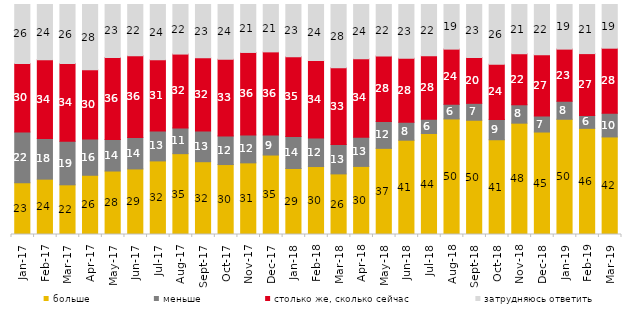
| Category | больше | меньше | столько же, сколько сейчас | затрудняюсь ответить |
|---|---|---|---|---|
| 2017-01-01 | 22.5 | 22.05 | 29.85 | 25.6 |
| 2017-02-01 | 24.05 | 17.7 | 34.2 | 24 |
| 2017-03-01 | 21.6 | 18.9 | 33.8 | 25.7 |
| 2017-04-01 | 25.75 | 15.8 | 30.05 | 28.4 |
| 2017-05-01 | 27.6 | 13.7 | 35.7 | 23 |
| 2017-06-01 | 28.5 | 13.65 | 35.6 | 22.25 |
| 2017-07-01 | 32 | 13 | 30.95 | 24.05 |
| 2017-08-01 | 35.15 | 11.2 | 32.1 | 21.55 |
| 2017-09-01 | 31.65 | 13.3 | 31.95 | 23.1 |
| 2017-10-01 | 30.4 | 12.45 | 33.35 | 23.75 |
| 2017-11-01 | 31.15 | 12.15 | 35.85 | 20.85 |
| 2017-12-01 | 34.55 | 8.7 | 36.15 | 20.6 |
| 2018-01-01 | 28.7 | 13.9 | 34.65 | 22.75 |
| 2018-02-01 | 29.55 | 12.4 | 33.7 | 24.35 |
| 2018-03-01 | 26.35 | 12.75 | 33.35 | 27.55 |
| 2018-04-01 | 29.6 | 12.7 | 34.1 | 23.6 |
| 2018-05-01 | 37.45 | 11.7 | 28.45 | 22.4 |
| 2018-06-01 | 41 | 7.8 | 27.85 | 23.35 |
| 2018-07-01 | 43.9 | 6.25 | 27.6 | 22.25 |
| 2018-08-01 | 50.25 | 6.35 | 24 | 19.4 |
| 2018-09-01 | 49.65 | 7.35 | 19.95 | 23 |
| 2018-10-01 | 41.2 | 8.85 | 23.95 | 26 |
| 2018-11-01 | 48.403 | 8.034 | 22.156 | 21.407 |
| 2018-12-01 | 44.55 | 6.95 | 26.7 | 21.8 |
| 2019-01-01 | 50.1 | 7.85 | 22.65 | 19.4 |
| 2019-02-01 | 46.15 | 5.6 | 26.9 | 21.35 |
| 2019-03-01 | 42.417 | 10.343 | 28.245 | 18.996 |